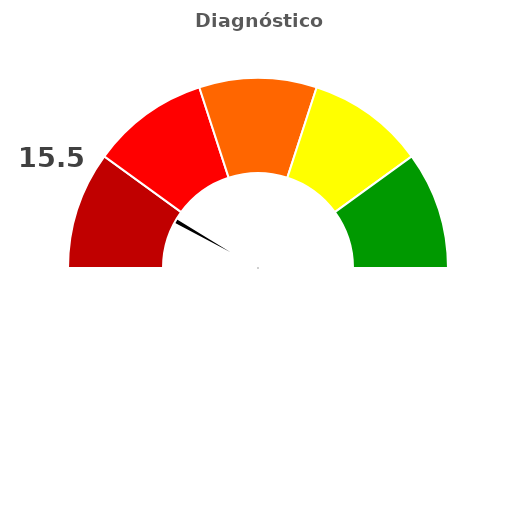
| Category | refe |
|---|---|
| 0 | 15.5 |
| 1 | 2 |
| 2 | 182.5 |